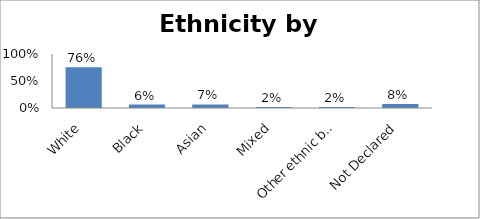
| Category | Series 0 |
|---|---|
| White | 0.757 |
| Black | 0.064 |
| Asian | 0.066 |
| Mixed | 0.02 |
| Other ethnic background | 0.018 |
| Not Declared | 0.075 |